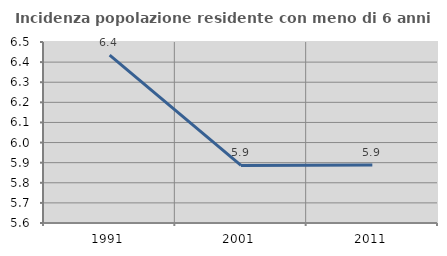
| Category | Incidenza popolazione residente con meno di 6 anni |
|---|---|
| 1991.0 | 6.435 |
| 2001.0 | 5.886 |
| 2011.0 | 5.888 |